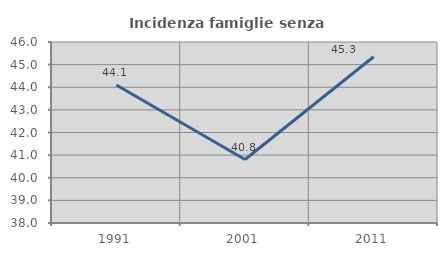
| Category | Incidenza famiglie senza nuclei |
|---|---|
| 1991.0 | 44.099 |
| 2001.0 | 40.805 |
| 2011.0 | 45.349 |